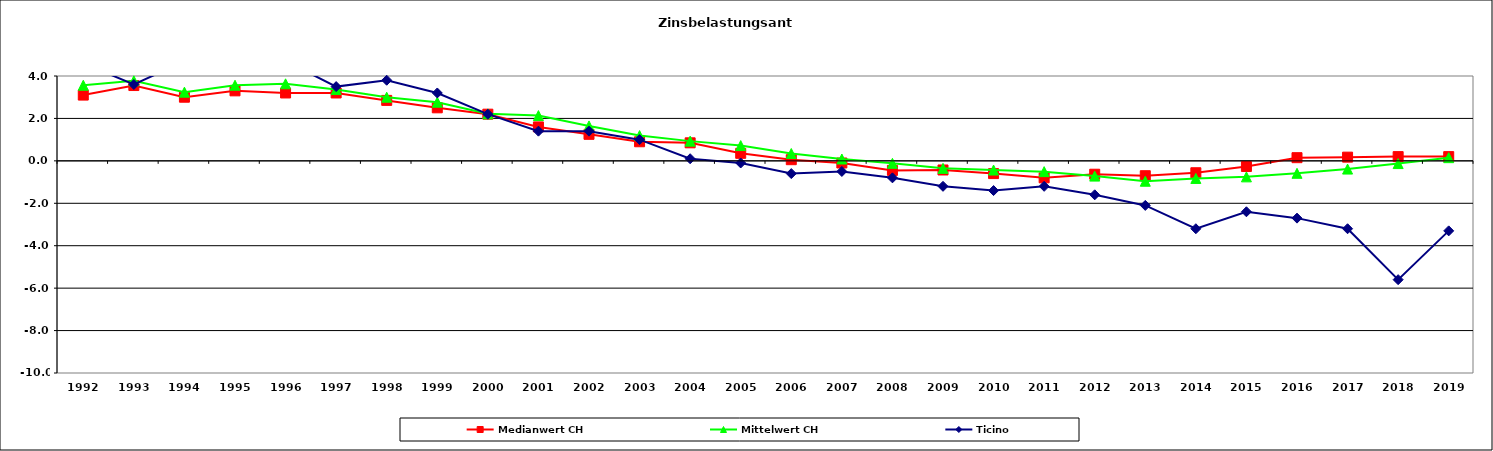
| Category | Medianwert CH | Mittelwert CH | Ticino |
|---|---|---|---|
| 1992.0 | 3.1 | 3.565 | 4.6 |
| 1993.0 | 3.55 | 3.772 | 3.6 |
| 1994.0 | 3 | 3.238 | 4.7 |
| 1995.0 | 3.3 | 3.565 | 4.6 |
| 1996.0 | 3.2 | 3.632 | 4.7 |
| 1997.0 | 3.2 | 3.361 | 3.5 |
| 1998.0 | 2.85 | 3 | 3.8 |
| 1999.0 | 2.5 | 2.765 | 3.2 |
| 2000.0 | 2.2 | 2.216 | 2.2 |
| 2001.0 | 1.6 | 2.135 | 1.4 |
| 2002.0 | 1.25 | 1.646 | 1.4 |
| 2003.0 | 0.9 | 1.191 | 1 |
| 2004.0 | 0.85 | 0.93 | 0.1 |
| 2005.0 | 0.355 | 0.72 | -0.1 |
| 2006.0 | 0.055 | 0.346 | -0.6 |
| 2007.0 | -0.1 | 0.087 | -0.5 |
| 2008.0 | -0.45 | -0.117 | -0.8 |
| 2009.0 | -0.43 | -0.354 | -1.2 |
| 2010.0 | -0.6 | -0.433 | -1.4 |
| 2011.0 | -0.8 | -0.508 | -1.2 |
| 2012.0 | -0.63 | -0.718 | -1.6 |
| 2013.0 | -0.7 | -0.96 | -2.1 |
| 2014.0 | -0.56 | -0.829 | -3.2 |
| 2015.0 | -0.265 | -0.755 | -2.4 |
| 2016.0 | 0.15 | -0.587 | -2.7 |
| 2017.0 | 0.175 | -0.387 | -3.2 |
| 2018.0 | 0.2 | -0.128 | -5.6 |
| 2019.0 | 0.2 | 0.151 | -3.3 |